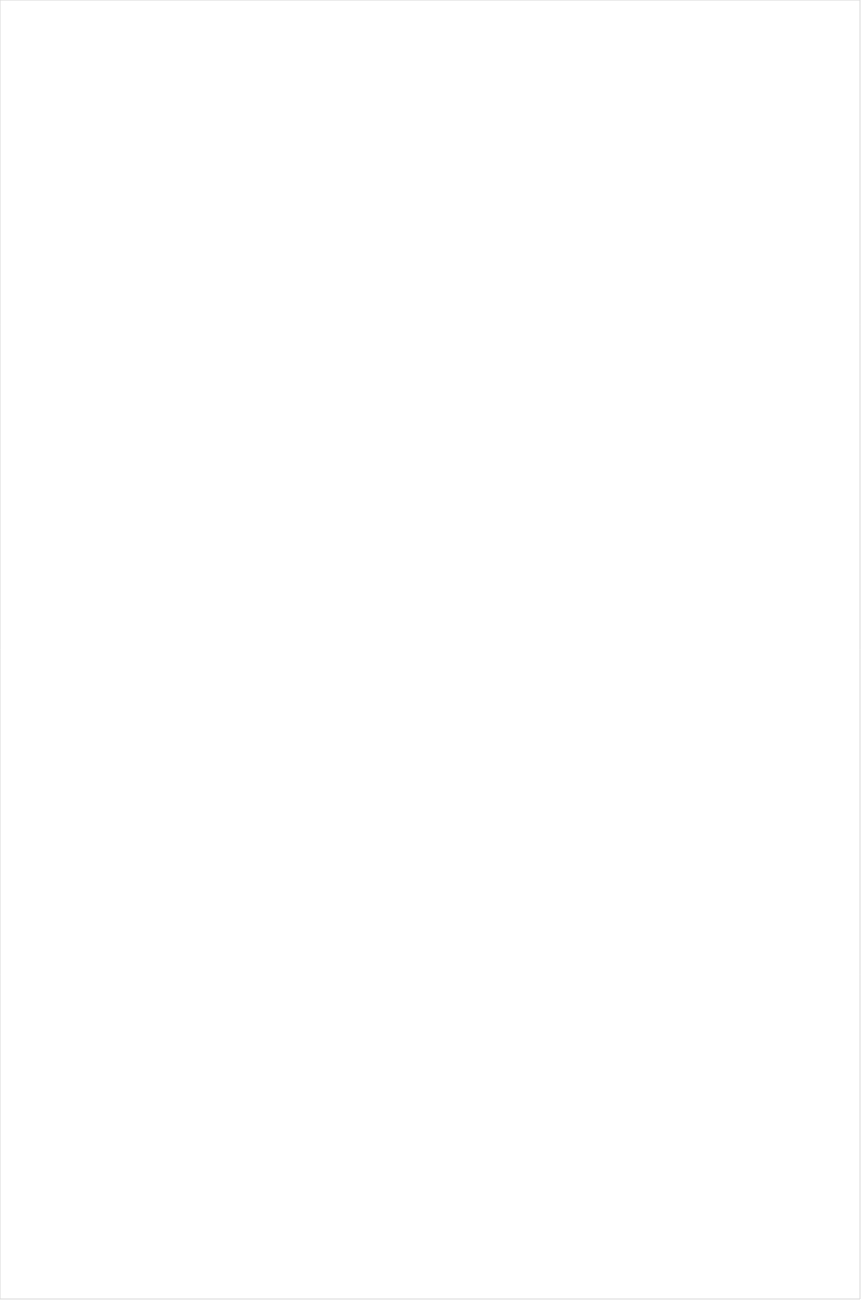
| Category | Total |
|---|---|
| RFD TV | -0.593 |
| Hallmark Movies & Mysteries | -0.55 |
| Hallmark | -0.507 |
| UniMas | -0.503 |
| Telemundo | -0.481 |
| Univision | -0.461 |
| UP TV | -0.426 |
| Travel | -0.424 |
| PBS | -0.42 |
| Science Channel | -0.332 |
| Discovery Life Channel | -0.322 |
| Fox Business | -0.289 |
| Galavision | -0.285 |
| Fox News | -0.284 |
| CMTV | -0.282 |
| History Channel | -0.282 |
| Great American Country | -0.261 |
| NBC Universo | -0.245 |
| DIY | -0.242 |
| INSP | -0.241 |
| Animal Planet | -0.232 |
| ION | -0.226 |
| POP | -0.203 |
| Investigation Discovery | -0.2 |
| Smithsonian | -0.173 |
| TLC | -0.16 |
| Outdoor Channel | -0.159 |
| CBS | -0.15 |
| National Geographic Wild | -0.15 |
| TV LAND | -0.147 |
| Weather Channel | -0.145 |
| WGN America | -0.131 |
| Discovery Channel | -0.13 |
| NBC | -0.129 |
| Discovery Family Channel | -0.122 |
| American Heroes Channel | -0.106 |
| Motor Trend Network | -0.101 |
| Destination America | -0.101 |
| HGTV | -0.087 |
| MyNetworkTV | -0.069 |
| CW | -0.065 |
| FYI | -0.064 |
| OXYGEN | -0.04 |
| Nick@Nite | -0.038 |
| Logo | -0.036 |
| SYFY | -0.028 |
| FOX | -0.022 |
| Headline News | -0.01 |
| Freeform | -0.004 |
| SundanceTV | 0 |
| E! | 0.019 |
| Cartoon Network | 0.044 |
| The Sportsman Channel | 0.058 |
| National Geographic | 0.058 |
| Food Network | 0.061 |
| Ovation | 0.065 |
| Lifetime Movies | 0.07 |
| Disney Channel | 0.077 |
| Reelz Channel | 0.083 |
| A&E | 0.083 |
| ABC | 0.098 |
| Disney XD | 0.1 |
| Nick | 0.108 |
| Adult Swim | 0.112 |
| WE TV | 0.12 |
| Lifetime | 0.122 |
| Disney Junior US | 0.129 |
| NHL | 0.157 |
| BRAVO | 0.16 |
| TBS | 0.168 |
| FX Movie Channel | 0.184 |
| AMC | 0.205 |
| TUDN | 0.219 |
| Nick Jr. | 0.225 |
| FX | 0.244 |
| Universal Kids | 0.246 |
| Cooking Channel | 0.247 |
| BBC America | 0.251 |
| Game Show | 0.255 |
| Nick Toons | 0.265 |
| Oprah Winfrey Network | 0.295 |
| Bloomberg HD | 0.309 |
| MSNBC | 0.312 |
| Paramount Network | 0.332 |
| Independent Film (IFC) | 0.341 |
| truTV | 0.352 |
| Comedy Central | 0.36 |
| MTV | 0.377 |
| USA Network | 0.398 |
| CNBC | 0.399 |
| Teen Nick | 0.416 |
| FXX | 0.518 |
| Viceland | 0.572 |
| TNT | 0.693 |
| FXDEP | 0.711 |
| CNN | 0.731 |
| Olympic Channel | 0.953 |
| Golf | 0.987 |
| VH1 | 1.101 |
| BET | 1.134 |
| FOX Sports 2 | 1.158 |
| MLB Network | 1.183 |
| BET Her | 1.303 |
| MTV2 | 1.392 |
| Tennis Channel | 1.401 |
| TV ONE | 1.474 |
| Fox Sports 1 | 1.556 |
| PAC-12 Network | 1.632 |
| NFL Network | 1.851 |
| CBS Sports | 1.88 |
| NBC Sports | 1.885 |
| Big Ten Network | 2.006 |
| ESPN Deportes | 2.077 |
| ESPN | 2.15 |
| ESPNU | 2.263 |
| ESPNEWS | 2.428 |
| ESPN2 | 3.021 |
| NBA TV | 7.402 |